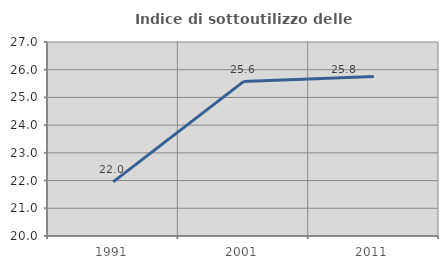
| Category | Indice di sottoutilizzo delle abitazioni  |
|---|---|
| 1991.0 | 21.951 |
| 2001.0 | 25.571 |
| 2011.0 | 25.755 |